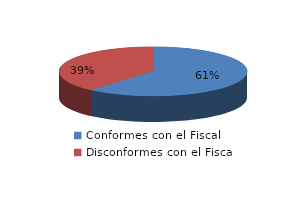
| Category | Series 0 |
|---|---|
| 0 | 60 |
| 1 | 38 |